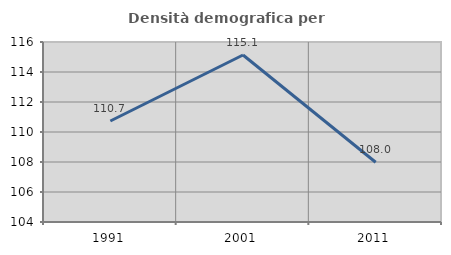
| Category | Densità demografica |
|---|---|
| 1991.0 | 110.732 |
| 2001.0 | 115.132 |
| 2011.0 | 107.982 |